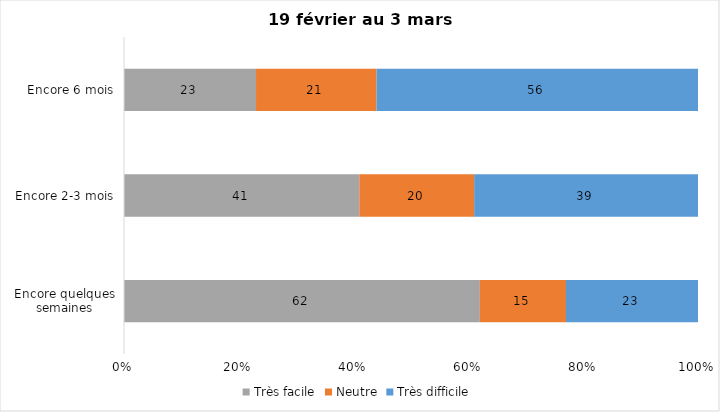
| Category | Très facile | Neutre | Très difficile |
|---|---|---|---|
| Encore quelques semaines | 62 | 15 | 23 |
| Encore 2-3 mois | 41 | 20 | 39 |
| Encore 6 mois | 23 | 21 | 56 |